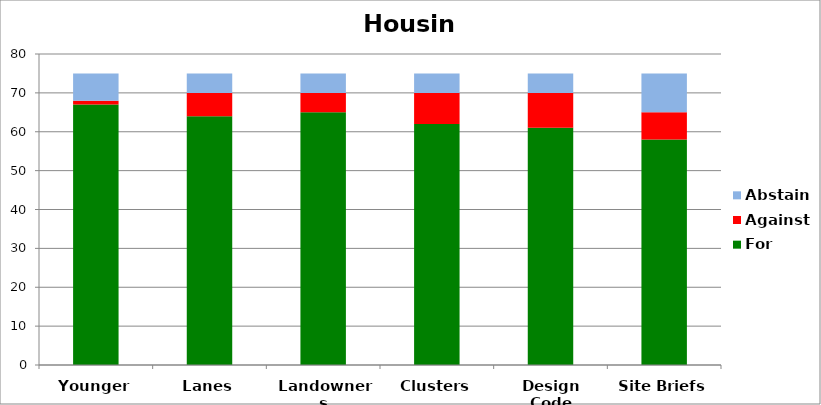
| Category | For | Against | Abstain |
|---|---|---|---|
| Younger | 67 | 1 | 7 |
| Lanes | 64 | 6 | 5 |
| Landowners | 65 | 5 | 5 |
| Clusters | 62 | 8 | 5 |
| Design Code | 61 | 9 | 5 |
| Site Briefs | 58 | 7 | 10 |